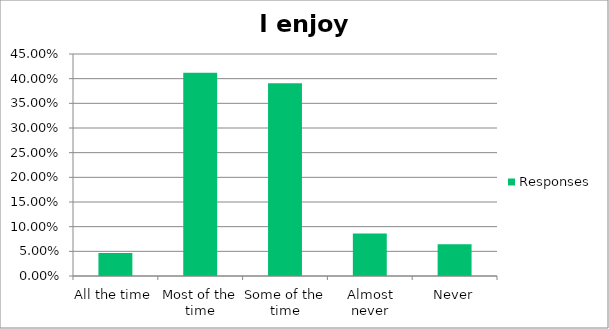
| Category | Responses |
|---|---|
| All the time | 0.047 |
| Most of the time | 0.412 |
| Some of the time | 0.391 |
| Almost never | 0.086 |
| Never | 0.064 |